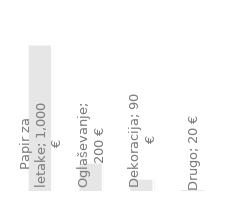
| Category | Letni stroški |
|---|---|
| Papir za letake | 1000 |
| Oglaševanje | 200 |
| Dekoracija | 90 |
| Drugo | 20 |